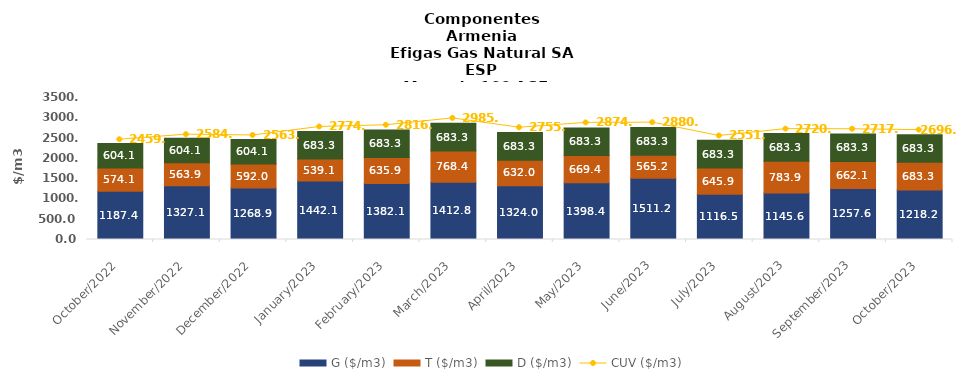
| Category | G ($/m3) | T ($/m3) | D ($/m3) |
|---|---|---|---|
| 2022-10-01 | 1187.44 | 574.12 | 604.09 |
| 2022-11-01 | 1327.14 | 563.85 | 604.09 |
| 2022-12-01 | 1268.91 | 592.03 | 604.09 |
| 2023-01-01 | 1442.084 | 539.064 | 683.343 |
| 2023-02-01 | 1382.137 | 635.944 | 683.343 |
| 2023-03-01 | 1412.843 | 768.353 | 683.343 |
| 2023-04-01 | 1324.021 | 631.998 | 683.343 |
| 2023-05-01 | 1398.419 | 669.403 | 683.343 |
| 2023-06-01 | 1511.242 | 565.219 | 683.343 |
| 2023-07-01 | 1116.463 | 645.939 | 683.343 |
| 2023-08-01 | 1145.565 | 783.894 | 683.343 |
| 2023-09-01 | 1257.568 | 662.12 | 683.343 |
| 2023-10-01 | 1218.237 | 683.343 | 683.34 |